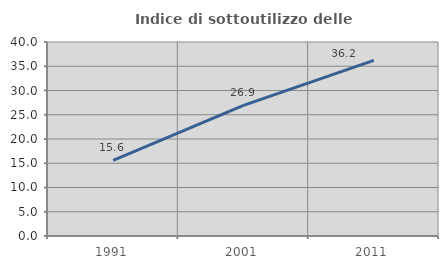
| Category | Indice di sottoutilizzo delle abitazioni  |
|---|---|
| 1991.0 | 15.57 |
| 2001.0 | 26.923 |
| 2011.0 | 36.203 |